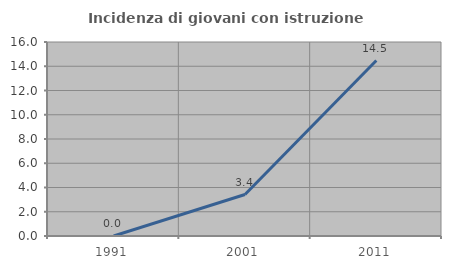
| Category | Incidenza di giovani con istruzione universitaria |
|---|---|
| 1991.0 | 0 |
| 2001.0 | 3.419 |
| 2011.0 | 14.474 |